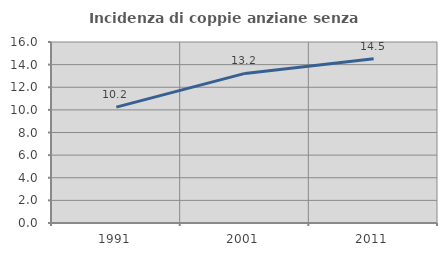
| Category | Incidenza di coppie anziane senza figli  |
|---|---|
| 1991.0 | 10.243 |
| 2001.0 | 13.223 |
| 2011.0 | 14.521 |